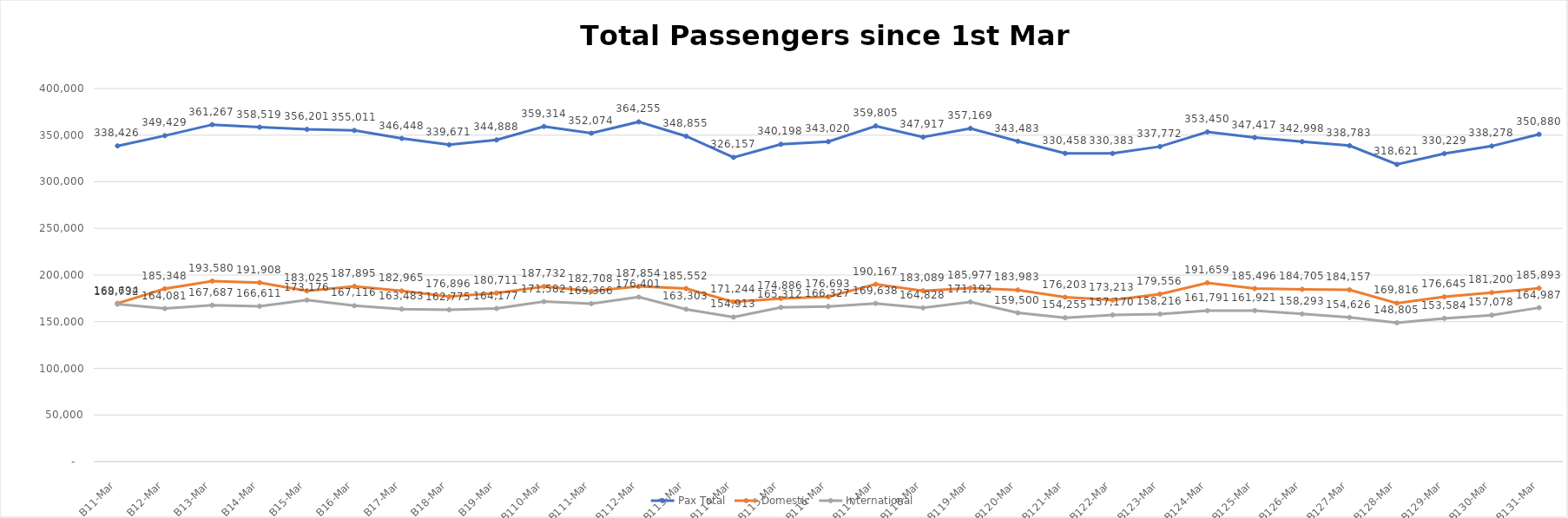
| Category | Pax Total |  Domestic  |  International  |
|---|---|---|---|
| 2023-03-01 | 338426 | 169694 | 168732 |
| 2023-03-02 | 349429 | 185348 | 164081 |
| 2023-03-03 | 361267 | 193580 | 167687 |
| 2023-03-04 | 358519 | 191908 | 166611 |
| 2023-03-05 | 356201 | 183025 | 173176 |
| 2023-03-06 | 355011 | 187895 | 167116 |
| 2023-03-07 | 346448 | 182965 | 163483 |
| 2023-03-08 | 339671 | 176896 | 162775 |
| 2023-03-09 | 344888 | 180711 | 164177 |
| 2023-03-10 | 359314 | 187732 | 171582 |
| 2023-03-11 | 352074 | 182708 | 169366 |
| 2023-03-12 | 364255 | 187854 | 176401 |
| 2023-03-13 | 348855 | 185552 | 163303 |
| 2023-03-14 | 326157 | 171244 | 154913 |
| 2023-03-15 | 340198 | 174886 | 165312 |
| 2023-03-16 | 343020 | 176693 | 166327 |
| 2023-03-17 | 359805 | 190167 | 169638 |
| 2023-03-18 | 347917 | 183089 | 164828 |
| 2023-03-19 | 357169 | 185977 | 171192 |
| 2023-03-20 | 343483 | 183983 | 159500 |
| 2023-03-21 | 330458 | 176203 | 154255 |
| 2023-03-22 | 330383 | 173213 | 157170 |
| 2023-03-23 | 337772 | 179556 | 158216 |
| 2023-03-24 | 353450 | 191659 | 161791 |
| 2023-03-25 | 347417 | 185496 | 161921 |
| 2023-03-26 | 342998 | 184705 | 158293 |
| 2023-03-27 | 338783 | 184157 | 154626 |
| 2023-03-28 | 318621 | 169816 | 148805 |
| 2023-03-29 | 330229 | 176645 | 153584 |
| 2023-03-30 | 338278 | 181200 | 157078 |
| 2023-03-31 | 350880 | 185893 | 164987 |